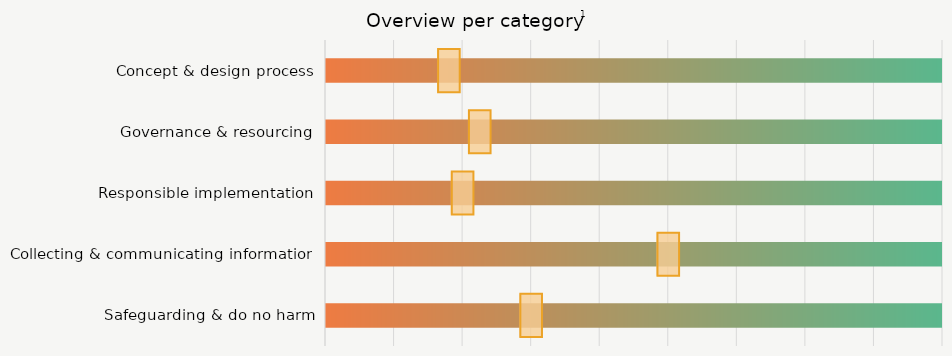
| Category | Max |
|---|---|
| Concept & design process | 9 |
| Governance & resourcing | 9 |
| Responsible implementation | 9 |
| Collecting & communicating information | 9 |
| Safeguarding & do no harm | 9 |